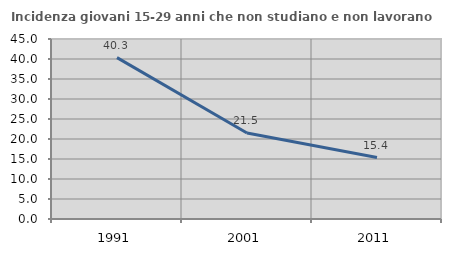
| Category | Incidenza giovani 15-29 anni che non studiano e non lavorano  |
|---|---|
| 1991.0 | 40.345 |
| 2001.0 | 21.502 |
| 2011.0 | 15.351 |